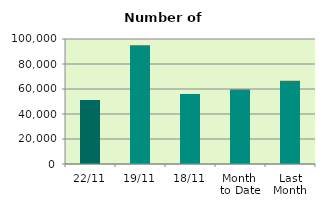
| Category | Series 0 |
|---|---|
| 22/11 | 51150 |
| 19/11 | 94970 |
| 18/11 | 56086 |
| Month 
to Date | 59537.5 |
| Last
Month | 66688.857 |